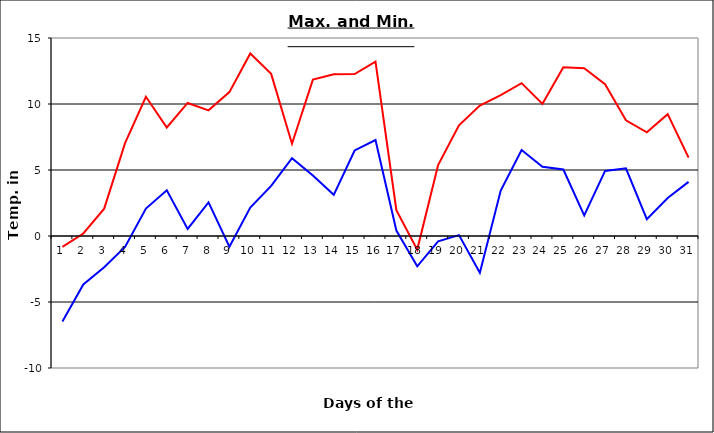
| Category | Series 0 | Series 1 |
|---|---|---|
| 0 | -0.83 | -6.48 |
| 1 | 0.19 | -3.67 |
| 2 | 2.07 | -2.36 |
| 3 | 7.04 | -0.83 |
| 4 | 10.55 | 2.08 |
| 5 | 8.22 | 3.46 |
| 6 | 10.08 | 0.54 |
| 7 | 9.52 | 2.55 |
| 8 | 10.9 | -0.81 |
| 9 | 13.83 | 2.16 |
| 10 | 12.28 | 3.8 |
| 11 | 6.99 | 5.89 |
| 12 | 11.85 | 4.58 |
| 13 | 12.26 | 3.12 |
| 14 | 12.27 | 6.48 |
| 15 | 13.21 | 7.27 |
| 16 | 1.96 | 0.41 |
| 17 | -1.03 | -2.3 |
| 18 | 5.37 | -0.4 |
| 19 | 8.38 | 0.07 |
| 20 | 9.88 | -2.79 |
| 21 | 10.67 | 3.44 |
| 22 | 11.58 | 6.51 |
| 23 | 10.01 | 5.25 |
| 24 | 12.78 | 5.04 |
| 25 | 12.71 | 1.56 |
| 26 | 11.5 | 4.93 |
| 27 | 8.76 | 5.13 |
| 28 | 7.86 | 1.28 |
| 29 | 9.23 | 2.88 |
| 30 | 5.94 | 4.1 |